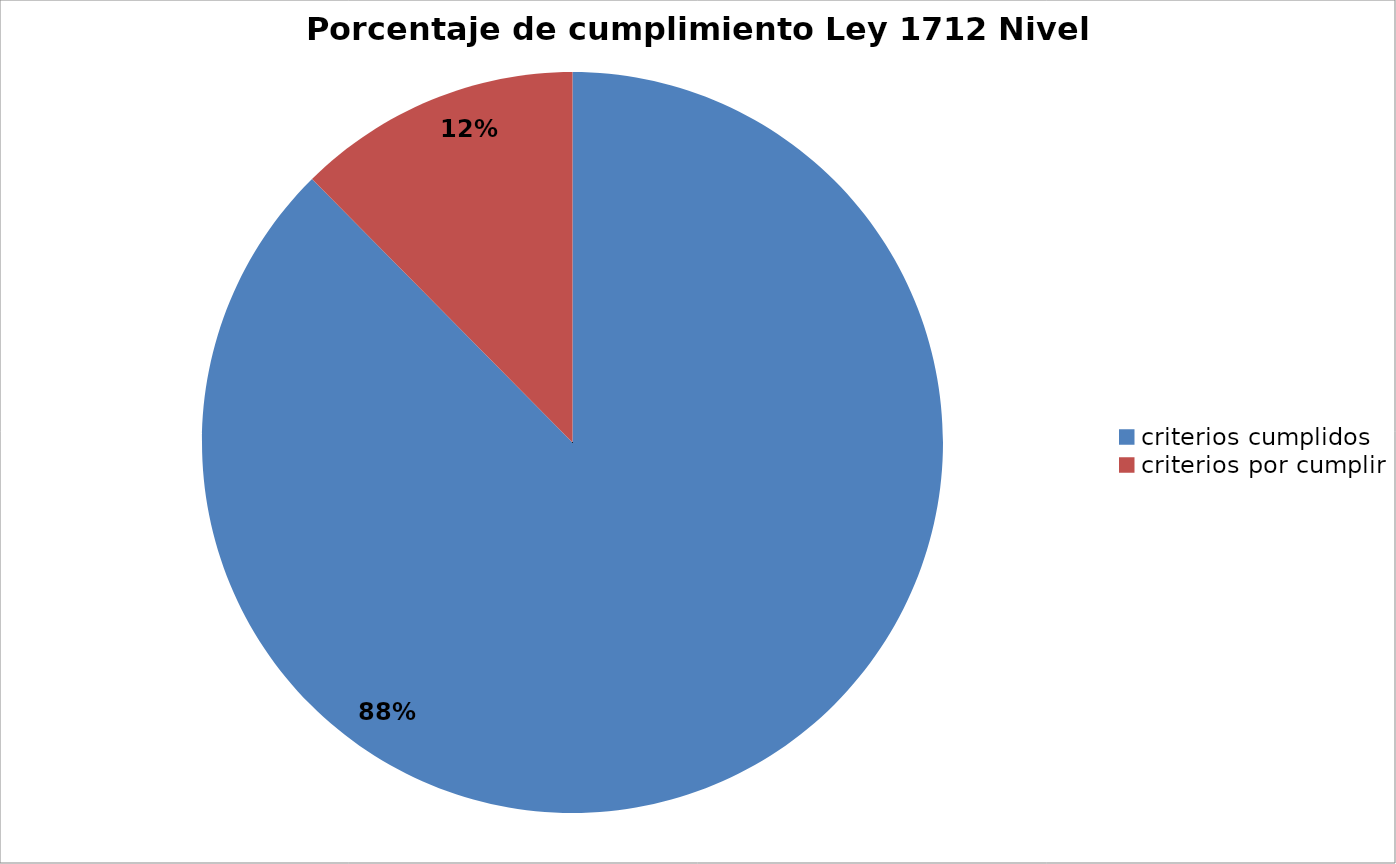
| Category | Series 0 |
|---|---|
| criterios cumplidos | 120 |
| criterios por cumplir | 17 |